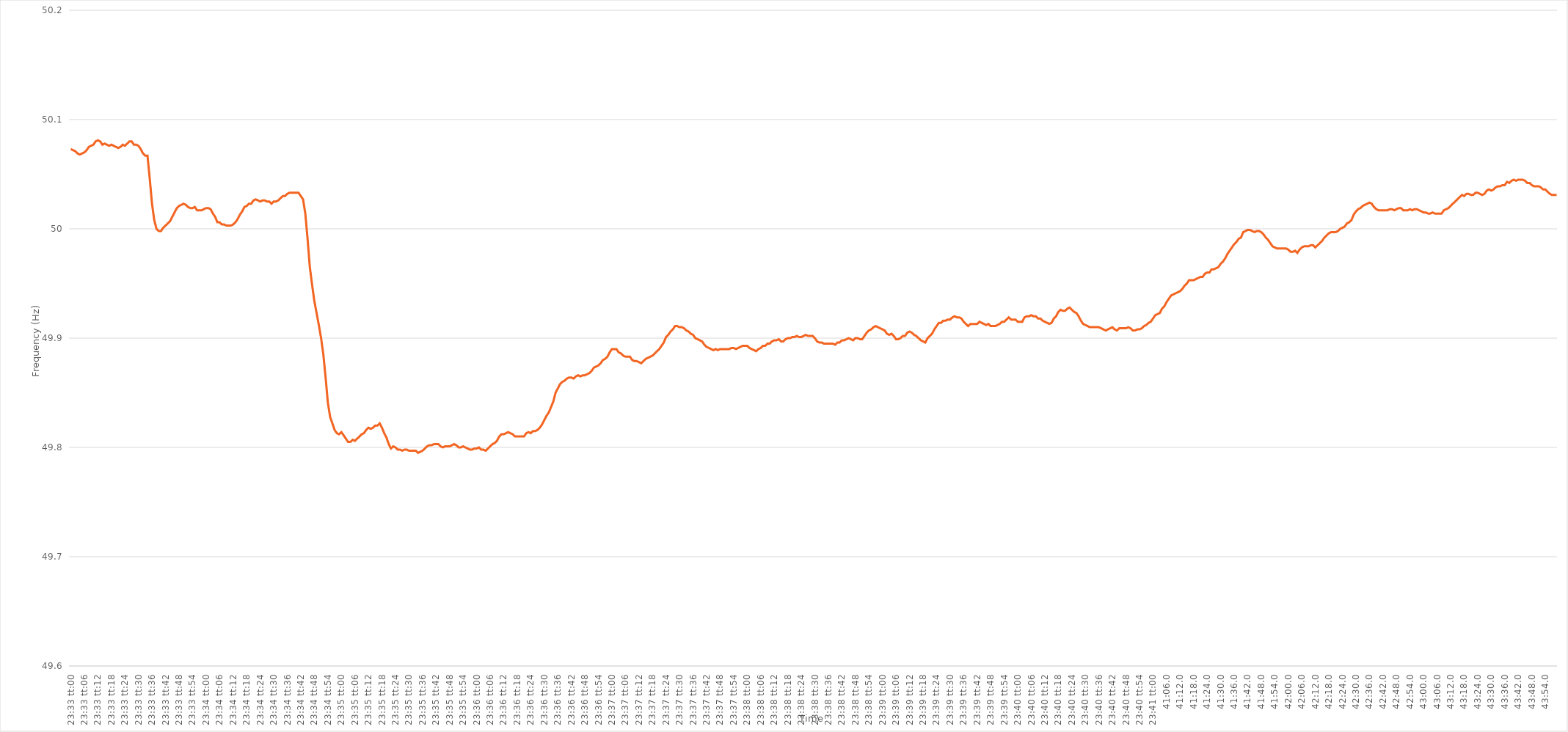
| Category | Series 0 |
|---|---|
| 0.9812500000000001 | 50.073 |
| 0.9812615740740741 | 50.072 |
| 0.9812731481481481 | 50.071 |
| 0.9812847222222222 | 50.069 |
| 0.9812962962962963 | 50.068 |
| 0.9813078703703703 | 50.069 |
| 0.9813194444444444 | 50.07 |
| 0.9813310185185186 | 50.072 |
| 0.9813425925925926 | 50.075 |
| 0.9813541666666666 | 50.076 |
| 0.9813657407407407 | 50.077 |
| 0.9813773148148148 | 50.08 |
| 0.981388888888889 | 50.081 |
| 0.9814004629629629 | 50.08 |
| 0.981412037037037 | 50.077 |
| 0.9814236111111111 | 50.078 |
| 0.9814351851851852 | 50.077 |
| 0.9814467592592592 | 50.076 |
| 0.9814583333333333 | 50.077 |
| 0.9814699074074075 | 50.076 |
| 0.9814814814814815 | 50.075 |
| 0.9814930555555555 | 50.074 |
| 0.9815046296296296 | 50.075 |
| 0.9815162037037037 | 50.077 |
| 0.9815277777777777 | 50.076 |
| 0.9815393518518518 | 50.078 |
| 0.981550925925926 | 50.08 |
| 0.9815625 | 50.08 |
| 0.981574074074074 | 50.077 |
| 0.9815856481481481 | 50.077 |
| 0.9815972222222222 | 50.076 |
| 0.9816087962962964 | 50.073 |
| 0.9816203703703703 | 50.069 |
| 0.9816319444444445 | 50.067 |
| 0.9816435185185185 | 50.067 |
| 0.9816550925925926 | 50.046 |
| 0.9816666666666666 | 50.023 |
| 0.9816782407407407 | 50.008 |
| 0.9816898148148149 | 50 |
| 0.9817013888888889 | 49.998 |
| 0.981712962962963 | 49.998 |
| 0.981724537037037 | 50.001 |
| 0.9817361111111111 | 50.003 |
| 0.9817476851851853 | 50.005 |
| 0.9817592592592592 | 50.007 |
| 0.9817708333333334 | 50.011 |
| 0.9817824074074074 | 50.015 |
| 0.9817939814814814 | 50.019 |
| 0.9818055555555555 | 50.021 |
| 0.9818171296296296 | 50.022 |
| 0.9818287037037038 | 50.023 |
| 0.9818402777777777 | 50.022 |
| 0.9818518518518519 | 50.02 |
| 0.9818634259259259 | 50.019 |
| 0.981875 | 50.019 |
| 0.981886574074074 | 50.02 |
| 0.9818981481481481 | 50.017 |
| 0.9819097222222223 | 50.017 |
| 0.9819212962962963 | 50.017 |
| 0.9819328703703704 | 50.018 |
| 0.9819444444444444 | 50.019 |
| 0.9819560185185185 | 50.019 |
| 0.9819675925925927 | 50.018 |
| 0.9819791666666666 | 50.014 |
| 0.9819907407407408 | 50.011 |
| 0.9820023148148148 | 50.006 |
| 0.982013888888889 | 50.006 |
| 0.9820254629629629 | 50.004 |
| 0.982037037037037 | 50.004 |
| 0.9820486111111112 | 50.003 |
| 0.9820601851851851 | 50.003 |
| 0.9820717592592593 | 50.003 |
| 0.9820833333333333 | 50.004 |
| 0.9820949074074075 | 50.006 |
| 0.9821064814814814 | 50.009 |
| 0.9821180555555555 | 50.013 |
| 0.9821296296296297 | 50.016 |
| 0.9821412037037037 | 50.02 |
| 0.9821527777777778 | 50.021 |
| 0.9821643518518518 | 50.023 |
| 0.982175925925926 | 50.023 |
| 0.9821875000000001 | 50.026 |
| 0.982199074074074 | 50.027 |
| 0.9822106481481482 | 50.026 |
| 0.9822222222222222 | 50.025 |
| 0.9822337962962964 | 50.026 |
| 0.9822453703703703 | 50.026 |
| 0.9822569444444444 | 50.025 |
| 0.9822685185185186 | 50.025 |
| 0.9822800925925925 | 50.023 |
| 0.9822916666666667 | 50.025 |
| 0.9823032407407407 | 50.025 |
| 0.9823148148148149 | 50.026 |
| 0.9823263888888888 | 50.028 |
| 0.9823379629629629 | 50.03 |
| 0.9823495370370371 | 50.03 |
| 0.9823611111111111 | 50.032 |
| 0.9823726851851852 | 50.033 |
| 0.9823842592592592 | 50.033 |
| 0.9823958333333334 | 50.033 |
| 0.9824074074074075 | 50.033 |
| 0.9824189814814814 | 50.033 |
| 0.9824305555555556 | 50.03 |
| 0.9824421296296296 | 50.027 |
| 0.9824537037037038 | 50.014 |
| 0.9824652777777777 | 49.991 |
| 0.9824768518518519 | 49.965 |
| 0.982488425925926 | 49.949 |
| 0.9824999999999999 | 49.934 |
| 0.9825115740740741 | 49.923 |
| 0.9825231481481481 | 49.912 |
| 0.9825347222222223 | 49.9 |
| 0.9825462962962962 | 49.885 |
| 0.9825578703703703 | 49.864 |
| 0.9825694444444445 | 49.841 |
| 0.9825810185185185 | 49.828 |
| 0.9825925925925926 | 49.822 |
| 0.9826041666666666 | 49.816 |
| 0.9826157407407408 | 49.813 |
| 0.9826273148148149 | 49.812 |
| 0.9826388888888888 | 49.814 |
| 0.982650462962963 | 49.811 |
| 0.982662037037037 | 49.808 |
| 0.9826736111111112 | 49.805 |
| 0.9826851851851851 | 49.805 |
| 0.9826967592592593 | 49.807 |
| 0.9827083333333334 | 49.806 |
| 0.9827199074074073 | 49.808 |
| 0.9827314814814815 | 49.81 |
| 0.9827430555555555 | 49.812 |
| 0.9827546296296297 | 49.813 |
| 0.9827662037037036 | 49.816 |
| 0.9827777777777778 | 49.818 |
| 0.9827893518518519 | 49.817 |
| 0.9828009259259259 | 49.818 |
| 0.9828125 | 49.82 |
| 0.982824074074074 | 49.82 |
| 0.9828356481481482 | 49.822 |
| 0.9828472222222223 | 49.818 |
| 0.9828587962962962 | 49.813 |
| 0.9828703703703704 | 49.809 |
| 0.9828819444444444 | 49.803 |
| 0.9828935185185186 | 49.799 |
| 0.9829050925925925 | 49.801 |
| 0.9829166666666667 | 49.8 |
| 0.9829282407407408 | 49.798 |
| 0.9829398148148147 | 49.798 |
| 0.9829513888888889 | 49.797 |
| 0.9829629629629629 | 49.798 |
| 0.9829745370370371 | 49.798 |
| 0.982986111111111 | 49.797 |
| 0.9829976851851852 | 49.797 |
| 0.9830092592592593 | 49.797 |
| 0.9830208333333333 | 49.797 |
| 0.9830324074074074 | 49.795 |
| 0.9830439814814814 | 49.796 |
| 0.9830555555555556 | 49.797 |
| 0.9830671296296297 | 49.799 |
| 0.9830787037037036 | 49.801 |
| 0.9830902777777778 | 49.802 |
| 0.9831018518518518 | 49.802 |
| 0.983113425925926 | 49.803 |
| 0.9831249999999999 | 49.803 |
| 0.9831365740740741 | 49.803 |
| 0.9831481481481482 | 49.801 |
| 0.9831597222222223 | 49.8 |
| 0.9831712962962963 | 49.801 |
| 0.9831828703703703 | 49.801 |
| 0.9831944444444445 | 49.801 |
| 0.9832060185185186 | 49.802 |
| 0.9832175925925926 | 49.803 |
| 0.9832291666666667 | 49.802 |
| 0.9832407407407407 | 49.8 |
| 0.9832523148148148 | 49.8 |
| 0.9832638888888888 | 49.801 |
| 0.983275462962963 | 49.8 |
| 0.9832870370370371 | 49.799 |
| 0.983298611111111 | 49.798 |
| 0.9833101851851852 | 49.798 |
| 0.9833217592592592 | 49.799 |
| 0.9833333333333334 | 49.799 |
| 0.9833449074074073 | 49.8 |
| 0.9833564814814815 | 49.798 |
| 0.9833680555555556 | 49.798 |
| 0.9833796296296297 | 49.797 |
| 0.9833912037037037 | 49.799 |
| 0.9834027777777777 | 49.801 |
| 0.9834143518518519 | 49.803 |
| 0.983425925925926 | 49.804 |
| 0.9834375 | 49.806 |
| 0.9834490740740741 | 49.81 |
| 0.9834606481481482 | 49.812 |
| 0.9834722222222222 | 49.812 |
| 0.9834837962962962 | 49.813 |
| 0.9834953703703704 | 49.814 |
| 0.9835069444444445 | 49.813 |
| 0.9835185185185185 | 49.812 |
| 0.9835300925925926 | 49.81 |
| 0.9835416666666666 | 49.81 |
| 0.9835532407407408 | 49.81 |
| 0.9835648148148147 | 49.81 |
| 0.9835763888888889 | 49.81 |
| 0.983587962962963 | 49.813 |
| 0.9835995370370371 | 49.814 |
| 0.9836111111111111 | 49.813 |
| 0.9836226851851851 | 49.815 |
| 0.9836342592592593 | 49.815 |
| 0.9836458333333334 | 49.816 |
| 0.9836574074074074 | 49.818 |
| 0.9836689814814815 | 49.821 |
| 0.9836805555555556 | 49.825 |
| 0.9836921296296296 | 49.829 |
| 0.9837037037037036 | 49.832 |
| 0.9837152777777778 | 49.837 |
| 0.9837268518518519 | 49.842 |
| 0.9837384259259259 | 49.85 |
| 0.98375 | 49.854 |
| 0.983761574074074 | 49.858 |
| 0.9837731481481482 | 49.86 |
| 0.9837847222222221 | 49.861 |
| 0.9837962962962963 | 49.863 |
| 0.9838078703703704 | 49.864 |
| 0.9838194444444445 | 49.864 |
| 0.9838310185185185 | 49.863 |
| 0.9838425925925925 | 49.865 |
| 0.9838541666666667 | 49.866 |
| 0.9838657407407408 | 49.865 |
| 0.9838773148148148 | 49.866 |
| 0.9838888888888889 | 49.866 |
| 0.983900462962963 | 49.867 |
| 0.983912037037037 | 49.868 |
| 0.983923611111111 | 49.87 |
| 0.9839351851851852 | 49.873 |
| 0.9839467592592593 | 49.874 |
| 0.9839583333333333 | 49.875 |
| 0.9839699074074074 | 49.877 |
| 0.9839814814814815 | 49.88 |
| 0.9839930555555556 | 49.881 |
| 0.9840046296296295 | 49.883 |
| 0.9840162037037037 | 49.887 |
| 0.9840277777777778 | 49.89 |
| 0.9840393518518519 | 49.89 |
| 0.9840509259259259 | 49.89 |
| 0.9840625 | 49.887 |
| 0.9840740740740741 | 49.886 |
| 0.9840856481481483 | 49.884 |
| 0.9840972222222222 | 49.883 |
| 0.9841087962962963 | 49.883 |
| 0.9841203703703704 | 49.883 |
| 0.9841319444444444 | 49.88 |
| 0.9841435185185184 | 49.879 |
| 0.9841550925925926 | 49.879 |
| 0.9841666666666667 | 49.878 |
| 0.9841782407407407 | 49.877 |
| 0.9841898148148148 | 49.879 |
| 0.9842013888888889 | 49.881 |
| 0.984212962962963 | 49.882 |
| 0.9842245370370369 | 49.883 |
| 0.9842361111111111 | 49.884 |
| 0.9842476851851852 | 49.886 |
| 0.9842592592592593 | 49.888 |
| 0.9842708333333333 | 49.89 |
| 0.9842824074074074 | 49.893 |
| 0.9842939814814815 | 49.896 |
| 0.9843055555555557 | 49.901 |
| 0.9843171296296296 | 49.903 |
| 0.9843287037037037 | 49.906 |
| 0.9843402777777778 | 49.908 |
| 0.9843518518518519 | 49.911 |
| 0.9843634259259259 | 49.911 |
| 0.984375 | 49.91 |
| 0.9843865740740741 | 49.91 |
| 0.9843981481481481 | 49.909 |
| 0.9844097222222222 | 49.907 |
| 0.9844212962962963 | 49.906 |
| 0.9844328703703704 | 49.904 |
| 0.9844444444444443 | 49.903 |
| 0.9844560185185185 | 49.9 |
| 0.9844675925925926 | 49.899 |
| 0.9844791666666667 | 49.898 |
| 0.9844907407407407 | 49.897 |
| 0.9845023148148148 | 49.894 |
| 0.9845138888888889 | 49.892 |
| 0.9845254629629631 | 49.891 |
| 0.984537037037037 | 49.89 |
| 0.9845486111111111 | 49.889 |
| 0.9845601851851852 | 49.89 |
| 0.9845717592592593 | 49.889 |
| 0.9845833333333333 | 49.89 |
| 0.9845949074074074 | 49.89 |
| 0.9846064814814816 | 49.89 |
| 0.9846180555555556 | 49.89 |
| 0.9846296296296296 | 49.89 |
| 0.9846412037037037 | 49.891 |
| 0.9846527777777778 | 49.891 |
| 0.9846643518518517 | 49.89 |
| 0.9846759259259259 | 49.891 |
| 0.9846875 | 49.892 |
| 0.9846990740740741 | 49.893 |
| 0.9847106481481481 | 49.893 |
| 0.9847222222222222 | 49.893 |
| 0.9847337962962963 | 49.891 |
| 0.9847453703703705 | 49.89 |
| 0.9847569444444444 | 49.889 |
| 0.9847685185185185 | 49.888 |
| 0.9847800925925926 | 49.89 |
| 0.9847916666666667 | 49.891 |
| 0.9848032407407407 | 49.893 |
| 0.9848148148148148 | 49.893 |
| 0.984826388888889 | 49.895 |
| 0.984837962962963 | 49.895 |
| 0.984849537037037 | 49.897 |
| 0.9848611111111111 | 49.898 |
| 0.9848726851851852 | 49.898 |
| 0.9848842592592592 | 49.899 |
| 0.9848958333333333 | 49.897 |
| 0.9849074074074075 | 49.897 |
| 0.9849189814814815 | 49.899 |
| 0.9849305555555555 | 49.9 |
| 0.9849421296296296 | 49.9 |
| 0.9849537037037037 | 49.901 |
| 0.9849652777777779 | 49.901 |
| 0.9849768518518518 | 49.902 |
| 0.984988425925926 | 49.901 |
| 0.985 | 49.901 |
| 0.9850115740740741 | 49.902 |
| 0.9850231481481481 | 49.903 |
| 0.9850347222222222 | 49.902 |
| 0.9850462962962964 | 49.902 |
| 0.9850578703703704 | 49.902 |
| 0.9850694444444444 | 49.9 |
| 0.9850810185185185 | 49.897 |
| 0.9850925925925926 | 49.896 |
| 0.9851041666666666 | 49.896 |
| 0.9851157407407407 | 49.895 |
| 0.9851273148148149 | 49.895 |
| 0.9851388888888889 | 49.895 |
| 0.9851504629629629 | 49.895 |
| 0.985162037037037 | 49.895 |
| 0.9851736111111111 | 49.894 |
| 0.9851851851851853 | 49.896 |
| 0.9851967592592592 | 49.896 |
| 0.9852083333333334 | 49.898 |
| 0.9852199074074074 | 49.898 |
| 0.9852314814814815 | 49.899 |
| 0.9852430555555555 | 49.9 |
| 0.9852546296296296 | 49.899 |
| 0.9852662037037038 | 49.898 |
| 0.9852777777777778 | 49.9 |
| 0.9852893518518518 | 49.9 |
| 0.9853009259259259 | 49.899 |
| 0.9853125 | 49.899 |
| 0.985324074074074 | 49.902 |
| 0.9853356481481481 | 49.905 |
| 0.9853472222222223 | 49.907 |
| 0.9853587962962963 | 49.908 |
| 0.9853703703703703 | 49.91 |
| 0.9853819444444444 | 49.911 |
| 0.9853935185185185 | 49.91 |
| 0.9854050925925927 | 49.909 |
| 0.9854166666666666 | 49.908 |
| 0.9854282407407408 | 49.907 |
| 0.9854398148148148 | 49.904 |
| 0.985451388888889 | 49.903 |
| 0.9854629629629629 | 49.904 |
| 0.985474537037037 | 49.902 |
| 0.9854861111111112 | 49.899 |
| 0.9854976851851852 | 49.899 |
| 0.9855092592592593 | 49.9 |
| 0.9855208333333333 | 49.902 |
| 0.9855324074074074 | 49.902 |
| 0.9855439814814814 | 49.905 |
| 0.9855555555555555 | 49.906 |
| 0.9855671296296297 | 49.905 |
| 0.9855787037037037 | 49.903 |
| 0.9855902777777777 | 49.902 |
| 0.9856018518518518 | 49.9 |
| 0.9856134259259259 | 49.898 |
| 0.9856250000000001 | 49.897 |
| 0.985636574074074 | 49.896 |
| 0.9856481481481482 | 49.9 |
| 0.9856597222222222 | 49.902 |
| 0.9856712962962964 | 49.904 |
| 0.9856828703703703 | 49.908 |
| 0.9856944444444444 | 49.911 |
| 0.9857060185185186 | 49.914 |
| 0.9857175925925926 | 49.914 |
| 0.9857291666666667 | 49.916 |
| 0.9857407407407407 | 49.916 |
| 0.9857523148148148 | 49.917 |
| 0.985763888888889 | 49.917 |
| 0.9857754629629629 | 49.919 |
| 0.9857870370370371 | 49.92 |
| 0.9857986111111111 | 49.919 |
| 0.9858101851851853 | 49.919 |
| 0.9858217592592592 | 49.918 |
| 0.9858333333333333 | 49.915 |
| 0.9858449074074075 | 49.913 |
| 0.9858564814814814 | 49.911 |
| 0.9858680555555556 | 49.913 |
| 0.9858796296296296 | 49.913 |
| 0.9858912037037038 | 49.913 |
| 0.9859027777777777 | 49.913 |
| 0.9859143518518518 | 49.915 |
| 0.985925925925926 | 49.914 |
| 0.9859375 | 49.913 |
| 0.9859490740740741 | 49.912 |
| 0.9859606481481481 | 49.913 |
| 0.9859722222222222 | 49.911 |
| 0.9859837962962964 | 49.911 |
| 0.9859953703703703 | 49.911 |
| 0.9860069444444445 | 49.912 |
| 0.9860185185185185 | 49.913 |
| 0.9860300925925927 | 49.915 |
| 0.9860416666666666 | 49.915 |
| 0.9860532407407407 | 49.917 |
| 0.9860648148148149 | 49.919 |
| 0.9860763888888888 | 49.917 |
| 0.986087962962963 | 49.917 |
| 0.986099537037037 | 49.917 |
| 0.9861111111111112 | 49.915 |
| 0.9861226851851851 | 49.915 |
| 0.9861342592592592 | 49.915 |
| 0.9861458333333334 | 49.919 |
| 0.9861574074074074 | 49.92 |
| 0.9861689814814815 | 49.92 |
| 0.9861805555555555 | 49.921 |
| 0.9861921296296297 | 49.92 |
| 0.9862037037037038 | 49.92 |
| 0.9862152777777777 | 49.918 |
| 0.9862268518518519 | 49.918 |
| 0.9862384259259259 | 49.916 |
| 0.9862500000000001 | 49.915 |
| 0.986261574074074 | 49.914 |
| 0.9862731481481481 | 49.913 |
| 0.9862847222222223 | 49.914 |
| 0.9862962962962962 | 49.918 |
| 0.9863078703703704 | 49.92 |
| 0.9863194444444444 | 49.924 |
| 0.9863310185185186 | 49.926 |
| 0.9863425925925925 | 49.925 |
| 0.9863541666666666 | 49.925 |
| 0.9863657407407408 | 49.927 |
| 0.9863773148148148 | 49.928 |
| 0.9863888888888889 | 49.926 |
| 0.9864004629629629 | 49.924 |
| 0.9864120370370371 | 49.923 |
| 0.9864236111111112 | 49.92 |
| 0.9864351851851851 | 49.916 |
| 0.9864467592592593 | 49.913 |
| 0.9864583333333333 | 49.912 |
| 0.9864699074074075 | 49.911 |
| 0.9864814814814814 | 49.91 |
| 0.9864930555555556 | 49.91 |
| 0.9865046296296297 | 49.91 |
| 0.9865162037037036 | 49.91 |
| 0.9865277777777778 | 49.91 |
| 0.9865393518518518 | 49.909 |
| 0.986550925925926 | 49.908 |
| 0.9865624999999999 | 49.907 |
| 0.986574074074074 | 49.908 |
| 0.9865856481481482 | 49.909 |
| 0.9865972222222222 | 49.91 |
| 0.9866087962962963 | 49.908 |
| 0.9866203703703703 | 49.907 |
| 0.9866319444444445 | 49.909 |
| 0.9866435185185186 | 49.909 |
| 0.9866550925925925 | 49.909 |
| 0.9866666666666667 | 49.909 |
| 0.9866782407407407 | 49.91 |
| 0.9866898148148149 | 49.909 |
| 0.9867013888888888 | 49.907 |
| 0.986712962962963 | 49.907 |
| 0.9867245370370371 | 49.908 |
| 0.986736111111111 | 49.908 |
| 0.9867476851851852 | 49.909 |
| 0.9867592592592592 | 49.911 |
| 0.9867708333333334 | 49.912 |
| 0.9867824074074073 | 49.914 |
| 0.9867939814814815 | 49.915 |
| 0.9868055555555556 | 49.918 |
| 0.9868171296296296 | 49.921 |
| 0.9868287037037037 | 49.922 |
| 0.9868402777777777 | 49.923 |
| 0.9868518518518519 | 49.927 |
| 0.986863425925926 | 49.929 |
| 0.986875 | 49.933 |
| 0.9868865740740741 | 49.936 |
| 0.9868981481481481 | 49.939 |
| 0.9869097222222223 | 49.94 |
| 0.9869212962962962 | 49.941 |
| 0.9869328703703704 | 49.942 |
| 0.9869444444444445 | 49.943 |
| 0.9869560185185186 | 49.945 |
| 0.9869675925925926 | 49.948 |
| 0.9869791666666666 | 49.95 |
| 0.9869907407407408 | 49.953 |
| 0.9870023148148147 | 49.953 |
| 0.9870138888888889 | 49.953 |
| 0.987025462962963 | 49.954 |
| 0.987037037037037 | 49.955 |
| 0.9870486111111111 | 49.956 |
| 0.9870601851851851 | 49.956 |
| 0.9870717592592593 | 49.959 |
| 0.9870833333333334 | 49.96 |
| 0.9870949074074074 | 49.96 |
| 0.9871064814814815 | 49.963 |
| 0.9871180555555555 | 49.963 |
| 0.9871296296296297 | 49.964 |
| 0.9871412037037036 | 49.965 |
| 0.9871527777777778 | 49.968 |
| 0.9871643518518519 | 49.97 |
| 0.987175925925926 | 49.973 |
| 0.9871875 | 49.977 |
| 0.987199074074074 | 49.98 |
| 0.9872106481481482 | 49.983 |
| 0.9872222222222223 | 49.986 |
| 0.9872337962962963 | 49.988 |
| 0.9872453703703704 | 49.991 |
| 0.9872569444444445 | 49.992 |
| 0.9872685185185185 | 49.997 |
| 0.9872800925925925 | 49.998 |
| 0.9872916666666667 | 49.999 |
| 0.9873032407407408 | 49.999 |
| 0.9873148148148148 | 49.998 |
| 0.9873263888888889 | 49.997 |
| 0.987337962962963 | 49.998 |
| 0.9873495370370371 | 49.998 |
| 0.987361111111111 | 49.997 |
| 0.9873726851851852 | 49.995 |
| 0.9873842592592593 | 49.992 |
| 0.9873958333333334 | 49.99 |
| 0.9874074074074074 | 49.987 |
| 0.9874189814814814 | 49.984 |
| 0.9874305555555556 | 49.983 |
| 0.9874421296296297 | 49.982 |
| 0.9874537037037037 | 49.982 |
| 0.9874652777777778 | 49.982 |
| 0.9874768518518519 | 49.982 |
| 0.9874884259259259 | 49.982 |
| 0.9874999999999999 | 49.981 |
| 0.9875115740740741 | 49.979 |
| 0.9875231481481482 | 49.979 |
| 0.9875347222222222 | 49.98 |
| 0.9875462962962963 | 49.978 |
| 0.9875578703703703 | 49.981 |
| 0.9875694444444445 | 49.983 |
| 0.9875810185185184 | 49.984 |
| 0.9875925925925926 | 49.984 |
| 0.9876041666666667 | 49.984 |
| 0.9876157407407408 | 49.985 |
| 0.9876273148148148 | 49.985 |
| 0.9876388888888888 | 49.983 |
| 0.987650462962963 | 49.985 |
| 0.9876620370370371 | 49.987 |
| 0.9876736111111111 | 49.989 |
| 0.9876851851851852 | 49.992 |
| 0.9876967592592593 | 49.994 |
| 0.9877083333333333 | 49.996 |
| 0.9877199074074073 | 49.997 |
| 0.9877314814814815 | 49.997 |
| 0.9877430555555556 | 49.997 |
| 0.9877546296296296 | 49.998 |
| 0.9877662037037037 | 50 |
| 0.9877777777777778 | 50.001 |
| 0.9877893518518519 | 50.002 |
| 0.9878009259259258 | 50.005 |
| 0.9878125 | 50.006 |
| 0.9878240740740741 | 50.008 |
| 0.9878356481481482 | 50.013 |
| 0.9878472222222222 | 50.016 |
| 0.9878587962962962 | 50.018 |
| 0.9878703703703704 | 50.019 |
| 0.9878819444444445 | 50.021 |
| 0.9878935185185185 | 50.022 |
| 0.9879050925925926 | 50.023 |
| 0.9879166666666667 | 50.024 |
| 0.9879282407407407 | 50.023 |
| 0.9879398148148147 | 50.02 |
| 0.9879513888888889 | 50.018 |
| 0.987962962962963 | 50.017 |
| 0.987974537037037 | 50.017 |
| 0.9879861111111111 | 50.017 |
| 0.9879976851851852 | 50.017 |
| 0.9880092592592593 | 50.017 |
| 0.9880208333333332 | 50.018 |
| 0.9880324074074074 | 50.018 |
| 0.9880439814814815 | 50.017 |
| 0.9880555555555556 | 50.018 |
| 0.9880671296296296 | 50.019 |
| 0.9880787037037037 | 50.019 |
| 0.9880902777777778 | 50.017 |
| 0.988101851851852 | 50.017 |
| 0.9881134259259259 | 50.017 |
| 0.988125 | 50.018 |
| 0.9881365740740741 | 50.017 |
| 0.9881481481481481 | 50.018 |
| 0.9881597222222221 | 50.018 |
| 0.9881712962962963 | 50.017 |
| 0.9881828703703704 | 50.016 |
| 0.9881944444444444 | 50.015 |
| 0.9882060185185185 | 50.015 |
| 0.9882175925925926 | 50.014 |
| 0.9882291666666667 | 50.014 |
| 0.9882407407407406 | 50.015 |
| 0.9882523148148148 | 50.014 |
| 0.9882638888888889 | 50.014 |
| 0.988275462962963 | 50.014 |
| 0.988287037037037 | 50.014 |
| 0.9882986111111111 | 50.017 |
| 0.9883101851851852 | 50.018 |
| 0.9883217592592594 | 50.019 |
| 0.9883333333333333 | 50.021 |
| 0.9883449074074074 | 50.023 |
| 0.9883564814814815 | 50.025 |
| 0.9883680555555556 | 50.027 |
| 0.9883796296296296 | 50.029 |
| 0.9883912037037037 | 50.031 |
| 0.9884027777777779 | 50.03 |
| 0.9884143518518519 | 50.032 |
| 0.9884259259259259 | 50.032 |
| 0.9884375 | 50.031 |
| 0.9884490740740741 | 50.031 |
| 0.988460648148148 | 50.033 |
| 0.9884722222222222 | 50.033 |
| 0.9884837962962963 | 50.032 |
| 0.9884953703703704 | 50.031 |
| 0.9885069444444444 | 50.032 |
| 0.9885185185185185 | 50.035 |
| 0.9885300925925926 | 50.036 |
| 0.9885416666666668 | 50.035 |
| 0.9885532407407407 | 50.036 |
| 0.9885648148148148 | 50.038 |
| 0.9885763888888889 | 50.039 |
| 0.988587962962963 | 50.039 |
| 0.988599537037037 | 50.04 |
| 0.9886111111111111 | 50.04 |
| 0.9886226851851853 | 50.043 |
| 0.9886342592592593 | 50.042 |
| 0.9886458333333333 | 50.044 |
| 0.9886574074074074 | 50.045 |
| 0.9886689814814815 | 50.044 |
| 0.9886805555555555 | 50.045 |
| 0.9886921296296296 | 50.045 |
| 0.9887037037037038 | 50.045 |
| 0.9887152777777778 | 50.044 |
| 0.9887268518518518 | 50.042 |
| 0.9887384259259259 | 50.042 |
| 0.98875 | 50.04 |
| 0.9887615740740742 | 50.039 |
| 0.9887731481481481 | 50.039 |
| 0.9887847222222222 | 50.039 |
| 0.9887962962962963 | 50.038 |
| 0.9888078703703704 | 50.036 |
| 0.9888194444444444 | 50.036 |
| 0.9888310185185185 | 50.034 |
| 0.9888425925925927 | 50.032 |
| 0.9888541666666667 | 50.031 |
| 0.9888657407407407 | 50.031 |
| 0.9888773148148148 | 50.031 |